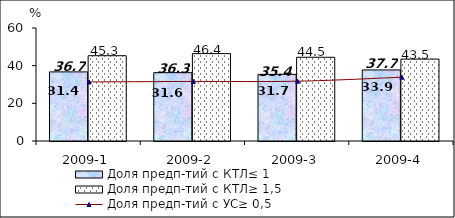
| Category | Доля предп-тий с КТЛ≤ 1 | Доля предп-тий с КТЛ≥ 1,5 |
|---|---|---|
| 2009-1 | 36.702 | 45.282 |
| 2009-2 | 36.293 | 46.397 |
| 2009-3 | 35.38 | 44.464 |
| 2009-4 | 37.731 | 43.494 |